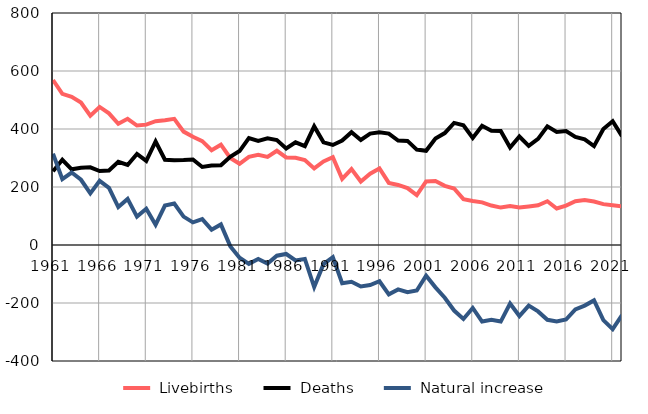
| Category |  Livebirths |  Deaths |  Natural increase |
|---|---|---|---|
| 1961.0 | 569 | 254 | 315 |
| 1962.0 | 521 | 294 | 227 |
| 1963.0 | 511 | 261 | 250 |
| 1964.0 | 491 | 266 | 225 |
| 1965.0 | 446 | 268 | 178 |
| 1966.0 | 476 | 255 | 221 |
| 1967.0 | 454 | 257 | 197 |
| 1968.0 | 418 | 287 | 131 |
| 1969.0 | 435 | 276 | 159 |
| 1970.0 | 412 | 314 | 98 |
| 1971.0 | 415 | 290 | 125 |
| 1972.0 | 427 | 357 | 70 |
| 1973.0 | 430 | 294 | 136 |
| 1974.0 | 435 | 292 | 143 |
| 1975.0 | 391 | 293 | 98 |
| 1976.0 | 373 | 295 | 78 |
| 1977.0 | 358 | 269 | 89 |
| 1978.0 | 327 | 274 | 53 |
| 1979.0 | 346 | 275 | 71 |
| 1980.0 | 300 | 304 | -4 |
| 1981.0 | 280 | 324 | -44 |
| 1982.0 | 304 | 369 | -65 |
| 1983.0 | 311 | 359 | -48 |
| 1984.0 | 304 | 368 | -64 |
| 1985.0 | 325 | 362 | -37 |
| 1986.0 | 302 | 333 | -31 |
| 1987.0 | 301 | 354 | -53 |
| 1988.0 | 293 | 341 | -48 |
| 1989.0 | 264 | 409 | -145 |
| 1990.0 | 288 | 354 | -66 |
| 1991.0 | 303 | 345 | -42 |
| 1992.0 | 228 | 360 | -132 |
| 1993.0 | 262 | 389 | -127 |
| 1994.0 | 219 | 362 | -143 |
| 1995.0 | 246 | 384 | -138 |
| 1996.0 | 264 | 389 | -125 |
| 1997.0 | 214 | 384 | -170 |
| 1998.0 | 207 | 360 | -153 |
| 1999.0 | 196 | 359 | -163 |
| 2000.0 | 172 | 329 | -157 |
| 2001.0 | 219 | 325 | -106 |
| 2002.0 | 221 | 367 | -146 |
| 2003.0 | 204 | 386 | -182 |
| 2004.0 | 195 | 421 | -226 |
| 2005.0 | 158 | 413 | -255 |
| 2006.0 | 152 | 369 | -217 |
| 2007.0 | 147 | 411 | -264 |
| 2008.0 | 136 | 394 | -258 |
| 2009.0 | 129 | 393 | -264 |
| 2010.0 | 134 | 336 | -202 |
| 2011.0 | 129 | 374 | -245 |
| 2012.0 | 133 | 342 | -209 |
| 2013.0 | 137 | 366 | -229 |
| 2014.0 | 151 | 409 | -258 |
| 2015.0 | 126 | 390 | -264 |
| 2016.0 | 136 | 393 | -257 |
| 2017.0 | 151 | 373 | -222 |
| 2018.0 | 155 | 364 | -209 |
| 2019.0 | 150 | 341 | -191 |
| 2020.0 | 141 | 400 | -259 |
| 2021.0 | 137 | 427 | -290 |
| 2022.0 | 133 | 375 | -242 |